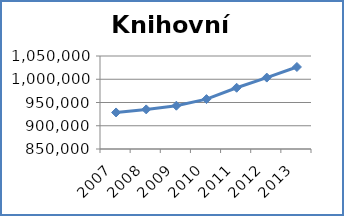
| Category | Knihovní fond |
|---|---|
| 2007.0 | 928566 |
| 2008.0 | 935166 |
| 2009.0 | 943089 |
| 2010.0 | 957301 |
| 2011.0 | 981687 |
| 2012.0 | 1003587 |
| 2013.0 | 1026394 |